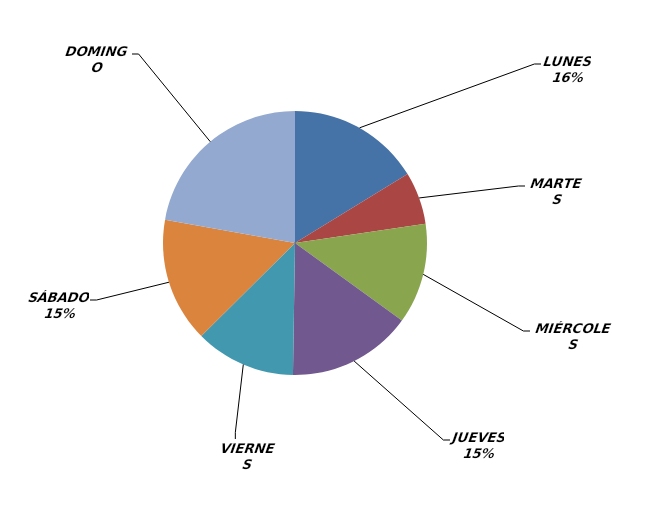
| Category | Series 0 |
|---|---|
| LUNES | 33 |
| MARTES | 13 |
| MIÉRCOLES | 25 |
| JUEVES | 31 |
| VIERNES | 25 |
| SÁBADO | 31 |
| DOMINGO | 45 |